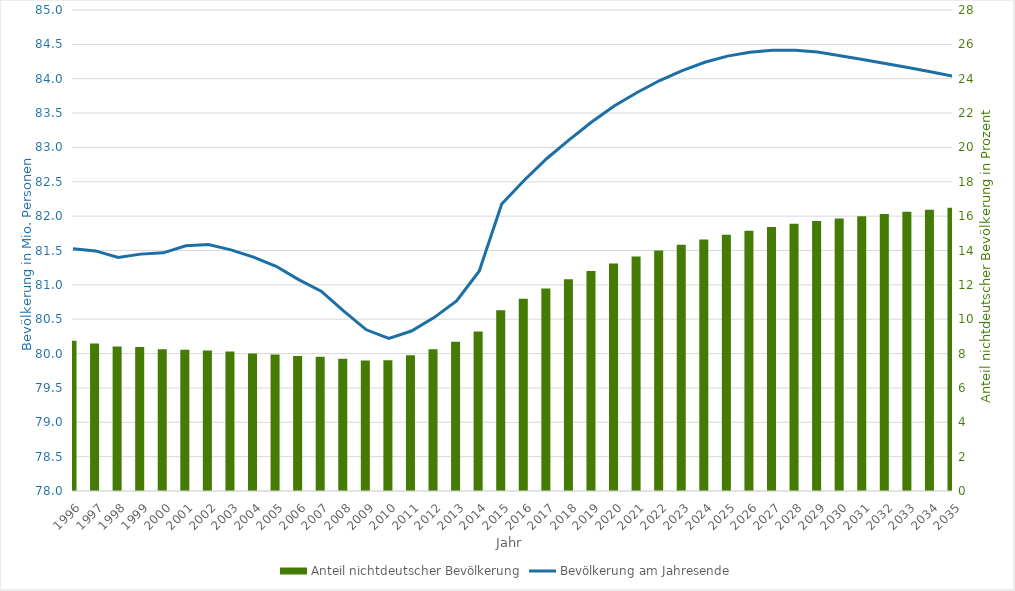
| Category | Anteil nichtdeutscher Bevölkerung |
|---|---|
| 1996.0 | 8.741 |
| 1997.0 | 8.593 |
| 1998.0 | 8.412 |
| 1999.0 | 8.378 |
| 2000.0 | 8.245 |
| 2001.0 | 8.22 |
| 2002.0 | 8.181 |
| 2003.0 | 8.114 |
| 2004.0 | 7.997 |
| 2005.0 | 7.945 |
| 2006.0 | 7.86 |
| 2007.0 | 7.81 |
| 2008.0 | 7.694 |
| 2009.0 | 7.595 |
| 2010.0 | 7.613 |
| 2011.0 | 7.896 |
| 2012.0 | 8.251 |
| 2013.0 | 8.686 |
| 2014.0 | 9.286 |
| 2015.0 | 10.529 |
| 2016.0 | 11.192 |
| 2017.0 | 11.794 |
| 2018.0 | 12.325 |
| 2019.0 | 12.81 |
| 2020.0 | 13.248 |
| 2021.0 | 13.645 |
| 2022.0 | 14.007 |
| 2023.0 | 14.335 |
| 2024.0 | 14.636 |
| 2025.0 | 14.91 |
| 2026.0 | 15.153 |
| 2027.0 | 15.365 |
| 2028.0 | 15.555 |
| 2029.0 | 15.722 |
| 2030.0 | 15.863 |
| 2031.0 | 15.996 |
| 2032.0 | 16.125 |
| 2033.0 | 16.253 |
| 2034.0 | 16.373 |
| 2035.0 | 16.488 |